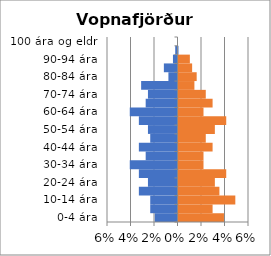
| Category | % karlar | %konur |
|---|---|---|
| 0-4 ára | -0.019 | 0.039 |
| 5-9 ára | -0.023 | 0.029 |
| 10-14 ára | -0.023 | 0.048 |
| 15-19 ára | -0.033 | 0.035 |
| 20-24 ára | -0.025 | 0.031 |
| 25-29 ára | -0.033 | 0.041 |
| 30-34 ára | -0.041 | 0.021 |
| 35-39 ára | -0.027 | 0.021 |
| 40-44 ára | -0.033 | 0.029 |
| 45-49 ára | -0.023 | 0.023 |
| 50-54 ára | -0.025 | 0.031 |
| 55-59 ára | -0.033 | 0.041 |
| 60-64 ára | -0.041 | 0.021 |
| 65-69 ára | -0.027 | 0.029 |
| 70-74 ára | -0.025 | 0.023 |
| 75-79 ára | -0.031 | 0.014 |
| 80-84 ára | -0.008 | 0.015 |
| 85-89 ára | -0.012 | 0.012 |
| 90-94 ára | -0.004 | 0.01 |
| 95-99 ára | -0.002 | 0 |
| 100 ára og eldri | 0 | 0 |